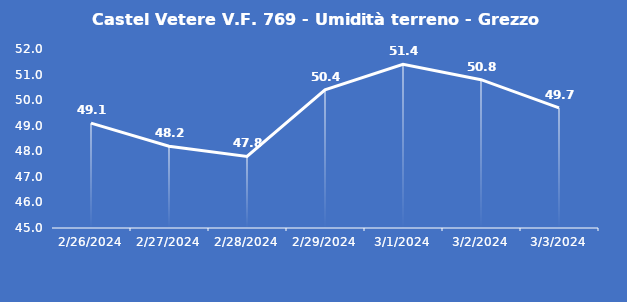
| Category | Castel Vetere V.F. 769 - Umidità terreno - Grezzo (%VWC) |
|---|---|
| 2/26/24 | 49.1 |
| 2/27/24 | 48.2 |
| 2/28/24 | 47.8 |
| 2/29/24 | 50.4 |
| 3/1/24 | 51.4 |
| 3/2/24 | 50.8 |
| 3/3/24 | 49.7 |